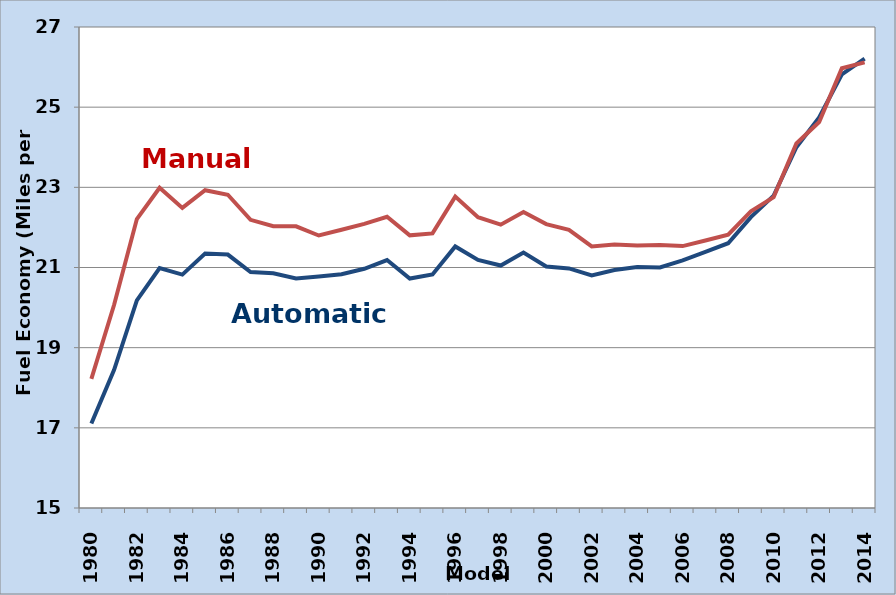
| Category | Automatic | Manual |
|---|---|---|
| 1980.0 | 17.106 | 18.22 |
| 1981.0 | 18.446 | 20.071 |
| 1982.0 | 20.18 | 22.209 |
| 1983.0 | 20.984 | 22.989 |
| 1984.0 | 20.822 | 22.487 |
| 1985.0 | 21.349 | 22.929 |
| 1986.0 | 21.323 | 22.815 |
| 1987.0 | 20.887 | 22.189 |
| 1988.0 | 20.854 | 22.031 |
| 1989.0 | 20.727 | 22.028 |
| 1990.0 | 20.774 | 21.798 |
| 1991.0 | 20.834 | 21.942 |
| 1992.0 | 20.969 | 22.089 |
| 1993.0 | 21.186 | 22.265 |
| 1994.0 | 20.723 | 21.802 |
| 1995.0 | 20.828 | 21.851 |
| 1996.0 | 21.525 | 22.769 |
| 1997.0 | 21.189 | 22.255 |
| 1998.0 | 21.048 | 22.07 |
| 1999.0 | 21.375 | 22.385 |
| 2000.0 | 21.026 | 22.083 |
| 2001.0 | 20.978 | 21.939 |
| 2002.0 | 20.801 | 21.525 |
| 2003.0 | 20.937 | 21.575 |
| 2004.0 | 21.01 | 21.551 |
| 2005.0 | 21.003 | 21.559 |
| 2006.0 | 21.178 | 21.534 |
| 2007.0 | 21.388 | 21.674 |
| 2008.0 | 21.606 | 21.821 |
| 2009.0 | 22.257 | 22.4 |
| 2010.0 | 22.793 | 22.757 |
| 2011.0 | 24 | 24.093 |
| 2012.0 | 24.746 | 24.629 |
| 2013.0 | 25.821 | 25.97 |
| 2014.0 | 26.212 | 26.118 |